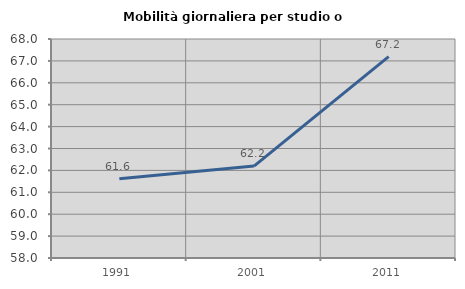
| Category | Mobilità giornaliera per studio o lavoro |
|---|---|
| 1991.0 | 61.618 |
| 2001.0 | 62.199 |
| 2011.0 | 67.193 |